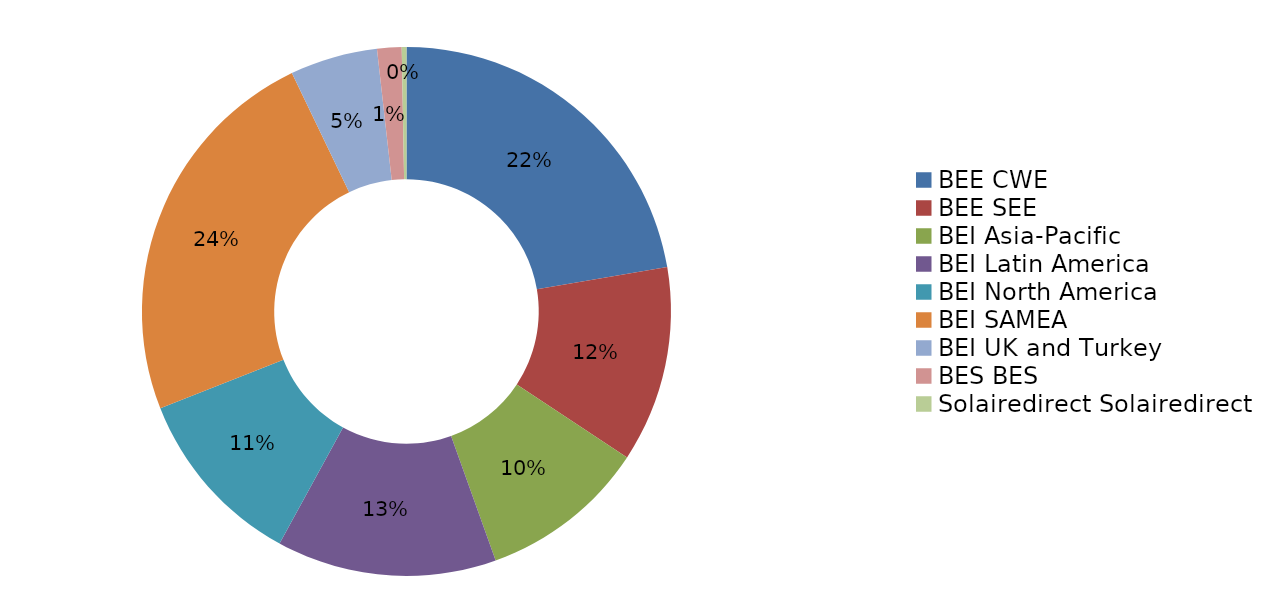
| Category | Total |
|---|---|
| 0 | 26139.881 |
| 1 | 14042.163 |
| 2 | 11974.852 |
| 3 | 15741.198 |
| 4 | 12971.024 |
| 5 | 27906.799 |
| 6 | 6267.85 |
| 7 | 1750.119 |
| 8 | 337.283 |